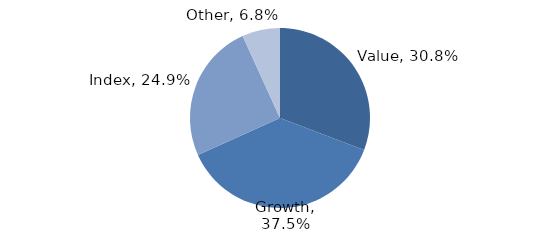
| Category | Investment Style |
|---|---|
| Value | 0.308 |
| Growth | 0.375 |
| Index | 0.249 |
| Other | 0.068 |